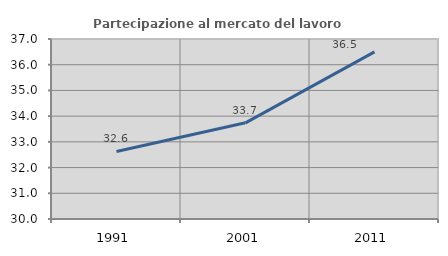
| Category | Partecipazione al mercato del lavoro  femminile |
|---|---|
| 1991.0 | 32.626 |
| 2001.0 | 33.74 |
| 2011.0 | 36.497 |